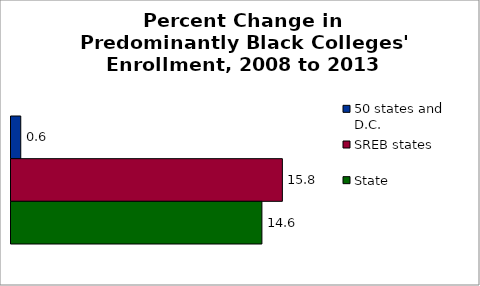
| Category | 50 states and D.C. | SREB states | State |
|---|---|---|---|
| 2008 to 2013 | 0.568 | 15.809 | 14.616 |